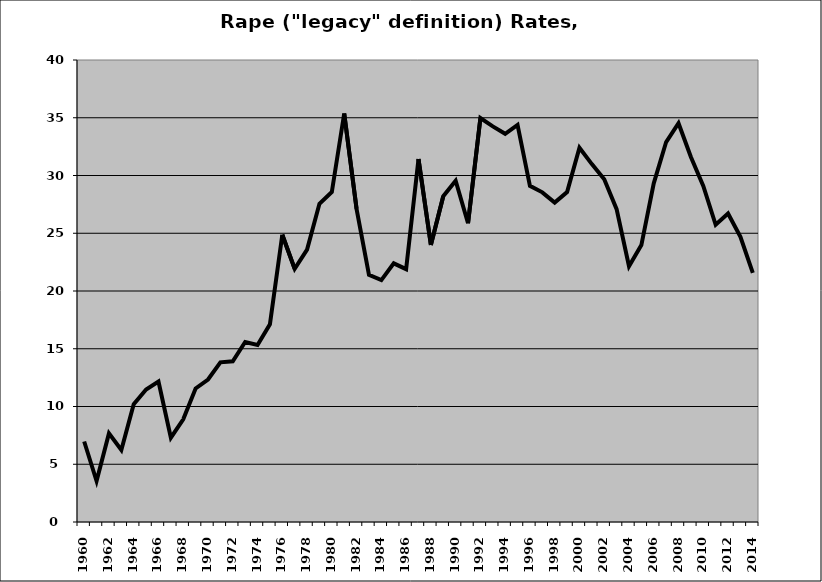
| Category | Rape |
|---|---|
| 1960.0 | 6.968 |
| 1961.0 | 3.55 |
| 1962.0 | 7.671 |
| 1963.0 | 6.231 |
| 1964.0 | 10.204 |
| 1965.0 | 11.471 |
| 1966.0 | 12.158 |
| 1967.0 | 7.302 |
| 1968.0 | 8.889 |
| 1969.0 | 11.562 |
| 1970.0 | 12.334 |
| 1971.0 | 13.824 |
| 1972.0 | 13.913 |
| 1973.0 | 15.581 |
| 1974.0 | 15.32 |
| 1975.0 | 17.112 |
| 1976.0 | 24.872 |
| 1977.0 | 21.921 |
| 1978.0 | 23.585 |
| 1979.0 | 27.556 |
| 1980.0 | 28.574 |
| 1981.0 | 35.366 |
| 1982.0 | 27.092 |
| 1983.0 | 21.401 |
| 1984.0 | 20.939 |
| 1985.0 | 22.397 |
| 1986.0 | 21.893 |
| 1987.0 | 31.429 |
| 1988.0 | 23.992 |
| 1989.0 | 28.211 |
| 1990.0 | 29.542 |
| 1991.0 | 25.87 |
| 1992.0 | 34.979 |
| 1993.0 | 34.255 |
| 1994.0 | 33.613 |
| 1995.0 | 34.375 |
| 1996.0 | 29.106 |
| 1997.0 | 28.542 |
| 1998.0 | 27.651 |
| 1999.0 | 28.565 |
| 2000.0 | 32.403 |
| 2001.0 | 30.987 |
| 2002.0 | 29.669 |
| 2003.0 | 27.086 |
| 2004.0 | 22.139 |
| 2005.0 | 23.978 |
| 2006.0 | 29.32 |
| 2007.0 | 32.898 |
| 2008.0 | 34.523 |
| 2009.0 | 31.602 |
| 2010.0 | 29.097 |
| 2011.0 | 25.733 |
| 2012.0 | 26.707 |
| 2013.0 | 24.69 |
| 2014.0 | 21.57 |